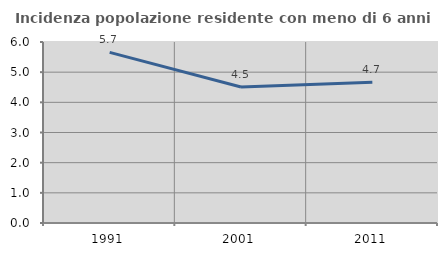
| Category | Incidenza popolazione residente con meno di 6 anni |
|---|---|
| 1991.0 | 5.657 |
| 2001.0 | 4.508 |
| 2011.0 | 4.667 |